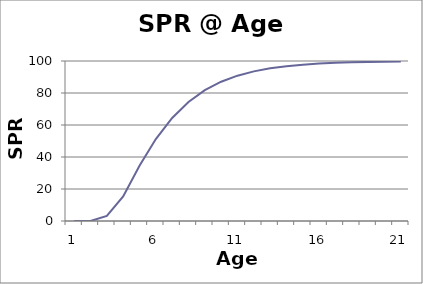
| Category | SPR (%) |
|---|---|
| 0 | 0 |
| 1 | 0 |
| 2 | 3.209 |
| 3 | 15.377 |
| 4 | 34.57 |
| 5 | 51.216 |
| 6 | 64.431 |
| 7 | 74.415 |
| 8 | 81.746 |
| 9 | 87.041 |
| 10 | 90.827 |
| 11 | 93.519 |
| 12 | 95.425 |
| 13 | 96.773 |
| 14 | 97.725 |
| 15 | 98.396 |
| 16 | 98.87 |
| 17 | 99.203 |
| 18 | 99.439 |
| 19 | 99.604 |
| 20 | 99.721 |